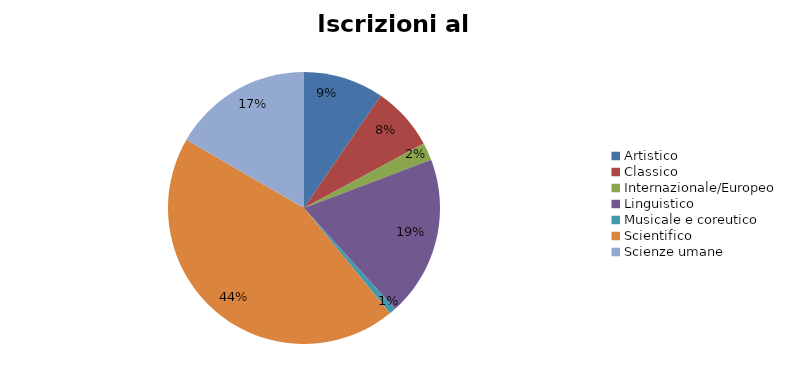
| Category | Series 0 | Series 1 |
|---|---|---|
| Artistico | 1715 |  |
| Classico | 1358 |  |
| Internazionale/Europeo | 375 |  |
| Linguistico | 3430 |  |
| Musicale e coreutico | 137 |  |
| Scientifico | 7943 |  |
| Scienze umane | 2981 |  |